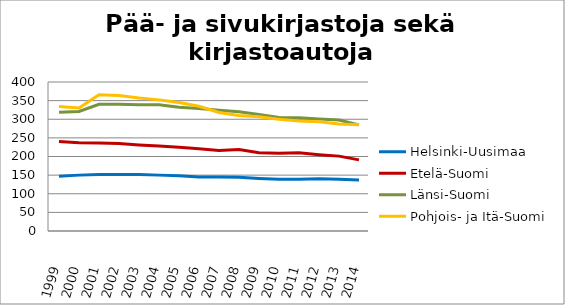
| Category | Helsinki-Uusimaa | Etelä-Suomi | Länsi-Suomi | Pohjois- ja Itä-Suomi |
|---|---|---|---|---|
| 1999.0 | 147 | 240 | 319 | 334 |
| 2000.0 | 150 | 237 | 321 | 330 |
| 2001.0 | 152 | 236 | 340 | 366 |
| 2002.0 | 152 | 235 | 340 | 364 |
| 2003.0 | 152 | 231 | 339 | 357 |
| 2004.0 | 150 | 228 | 339 | 352 |
| 2005.0 | 148 | 225 | 332 | 345 |
| 2006.0 | 145 | 221 | 329 | 335 |
| 2007.0 | 145 | 216 | 324 | 318 |
| 2008.0 | 144 | 219 | 320 | 310 |
| 2009.0 | 141 | 210 | 313 | 307 |
| 2010.0 | 139 | 209 | 305 | 300 |
| 2011.0 | 139 | 210 | 304 | 295 |
| 2012.0 | 140 | 205 | 301 | 293 |
| 2013.0 | 139 | 201 | 298 | 287 |
| 2014.0 | 137 | 191 | 285 | 285 |